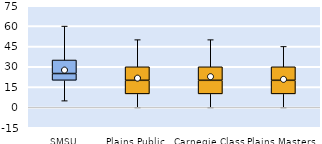
| Category | 25th | 50th | 75th |
|---|---|---|---|
| SMSU | 20 | 5 | 10 |
| Plains Public | 10 | 10 | 10 |
| Carnegie Class | 10 | 10 | 10 |
| Plains Masters | 10 | 10 | 10 |